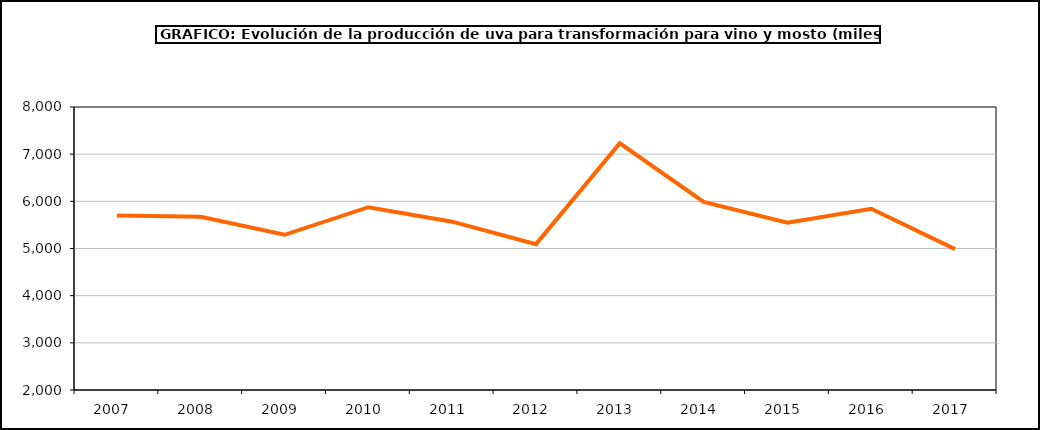
| Category | producción |
|---|---|
| 2007.0 | 5698.942 |
| 2008.0 | 5672.472 |
| 2009.0 | 5290.597 |
| 2010.0 | 5875.65 |
| 2011.0 | 5569.073 |
| 2012.0 | 5092.752 |
| 2013.0 | 7230.832 |
| 2014.0 | 5989.046 |
| 2015.0 | 5547.235 |
| 2016.0 | 5842.604 |
| 2017.0 | 4987.215 |